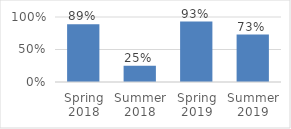
| Category | Series 0 |
|---|---|
| Spring 2018 | 0.89 |
| Summer 2018 | 0.25 |
| Spring 2019 | 0.93 |
| Summer 2019 | 0.73 |